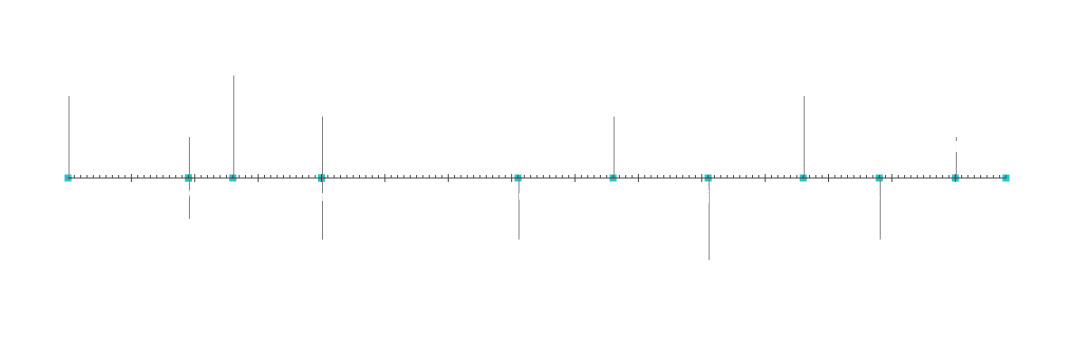
| Category | Pozicija |
|---|---|
| Početak projekta | 20 |
| Ključna tačka 1 | 10 |
| Ključna tačka 2 | -10 |
| Ključna tačka 3 | 25 |
| Ključna tačka 4 | -15 |
| Ključna tačka 5 | 15 |
| Ključna tačka 6 | -15 |
| Ključna tačka 7 | 15 |
| Ključna tačka 8 | -20 |
| Ključna tačka 9 | 20 |
| Ključna tačka 10 | -15 |
| Ključna tačka 11 | 10 |
| Kraj projekta | 5 |